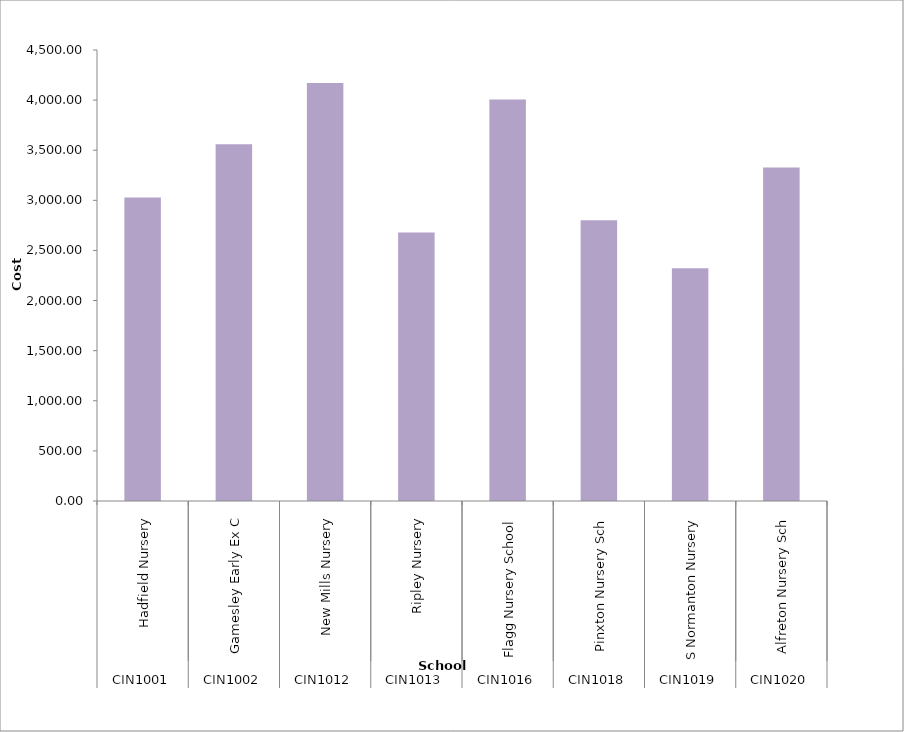
| Category | Teachers cost per pupil |
|---|---|
| 0 | 3027.134 |
| 1 | 3559.812 |
| 2 | 4170.527 |
| 3 | 2679.509 |
| 4 | 4007.074 |
| 5 | 2802.371 |
| 6 | 2321.962 |
| 7 | 3327.229 |